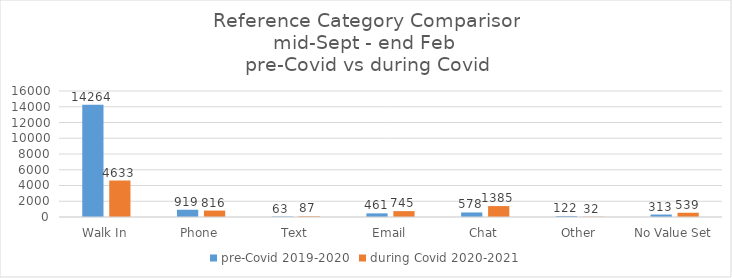
| Category | pre-Covid 2019-2020 | during Covid 2020-2021 |
|---|---|---|
| Walk In | 14264 | 4633 |
| Phone | 919 | 816 |
| Text | 63 | 87 |
| Email | 461 | 745 |
| Chat | 578 | 1385 |
| Other | 122 | 32 |
| No Value Set | 313 | 539 |